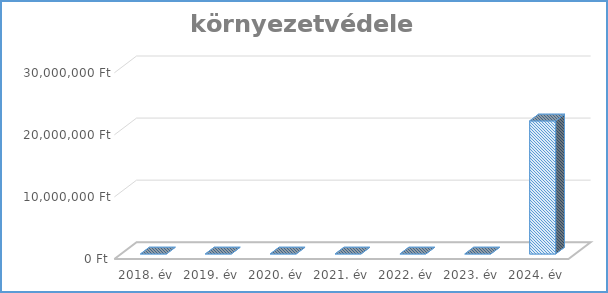
| Category | Környezetvédelem |
|---|---|
| 2018. év | 0 |
| 2019. év | 0 |
| 2020. év | 0 |
| 2021. év | 0 |
| 2022. év | 0 |
| 2023. év | 0 |
| 2024. év | 21437000 |